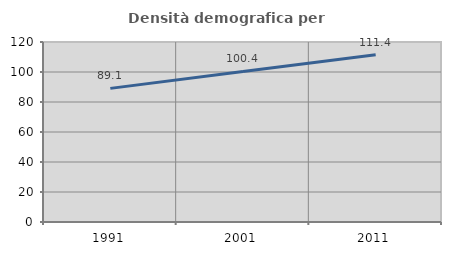
| Category | Densità demografica |
|---|---|
| 1991.0 | 89.084 |
| 2001.0 | 100.401 |
| 2011.0 | 111.428 |